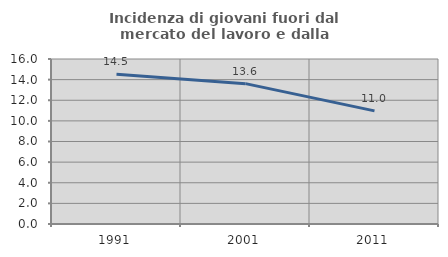
| Category | Incidenza di giovani fuori dal mercato del lavoro e dalla formazione  |
|---|---|
| 1991.0 | 14.51 |
| 2001.0 | 13.609 |
| 2011.0 | 10.968 |